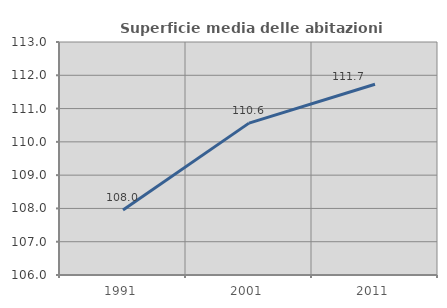
| Category | Superficie media delle abitazioni occupate |
|---|---|
| 1991.0 | 107.952 |
| 2001.0 | 110.563 |
| 2011.0 | 111.731 |